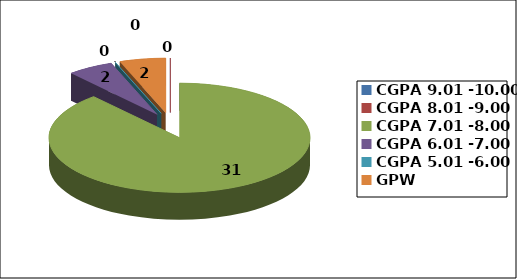
| Category | Series 0 |
|---|---|
| CGPA 9.01 -10.00 | 0 |
| CGPA 8.01 -9.00 | 0 |
| CGPA 7.01 -8.00 | 31 |
| CGPA 6.01 -7.00 | 2 |
| CGPA 5.01 -6.00 | 0 |
| GPW | 2 |